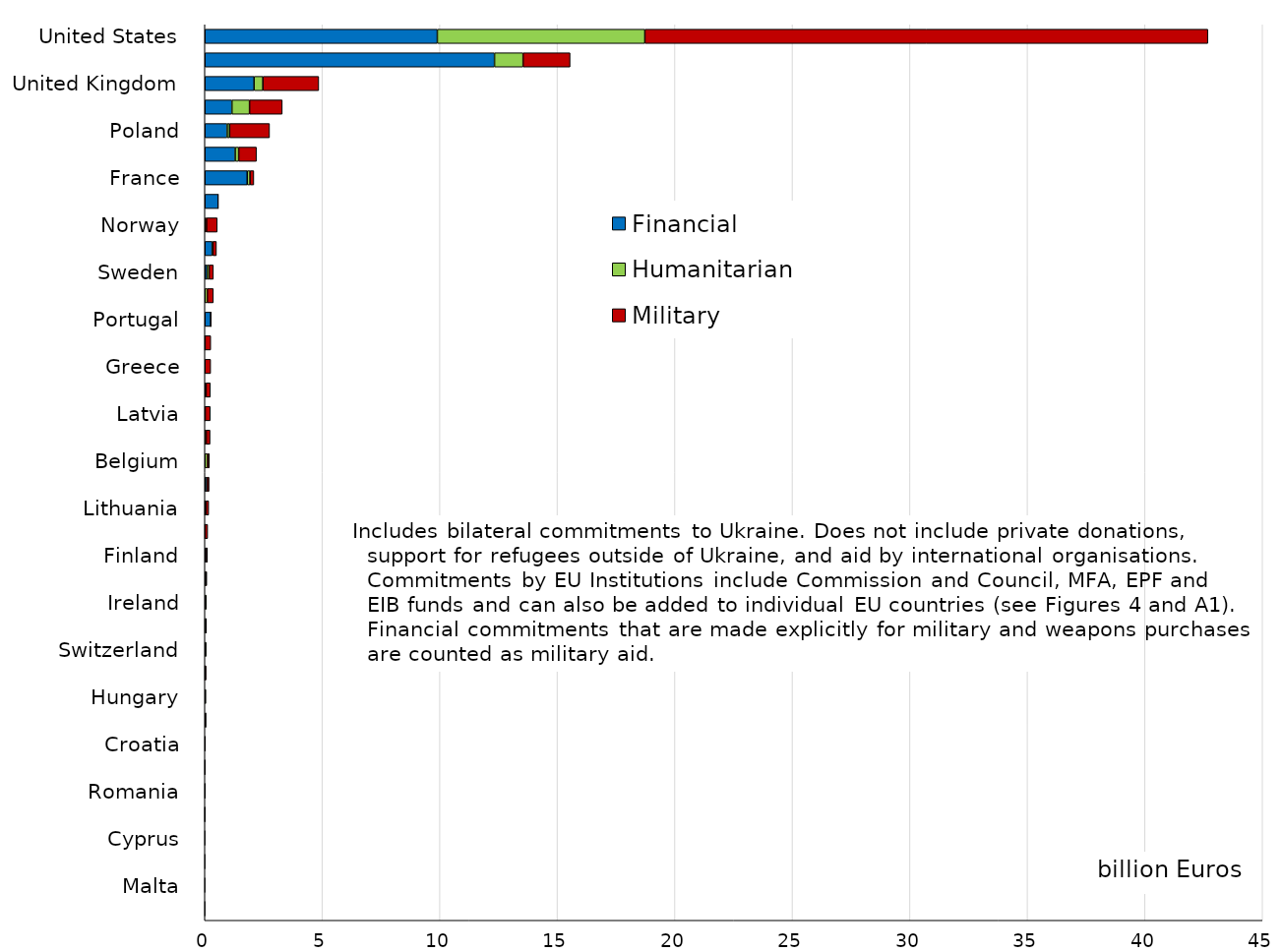
| Category | Financial | Humanitarian | Military |
|---|---|---|---|
| United States | 9.889 | 8.83 | 23.955 |
| EU Institutions | 12.322 | 1.215 | 2 |
| United Kingdom | 2.091 | 0.376 | 2.377 |
| Germany | 1.15 | 0.75 | 1.392 |
| Poland | 0.948 | 0.103 | 1.7 |
| Canada | 1.29 | 0.149 | 0.756 |
| France | 1.8 | 0.119 | 0.162 |
| Japan | 0.565 | 0.002 | 0 |
| Norway | 0.034 | 0.036 | 0.455 |
| Italy | 0.31 | 0.031 | 0.15 |
| Sweden | 0.091 | 0.086 | 0.184 |
| Czech Republic | 0 | 0.104 | 0.255 |
| Portugal | 0.25 | 0.001 | 0.009 |
| Estonia | 0 | 0.005 | 0.245 |
| Greece | 0 | 0 | 0.246 |
| Australia | 0 | 0.048 | 0.186 |
| Latvia | 0.01 | 0.001 | 0.219 |
| Denmark | 0.02 | 0.037 | 0.162 |
| Belgium | 0 | 0.116 | 0.076 |
| Netherlands | 0.08 | 0.027 | 0.071 |
| Lithuania | 0.005 | 0.042 | 0.116 |
| Slovakia | 0 | 0.005 | 0.113 |
| Finland | 0.075 | 0.002 | 0.029 |
| Spain | 0 | 0.044 | 0.037 |
| Ireland | 0 | 0.065 | 0 |
| Austria | 0.01 | 0.045 | 0.003 |
| Switzerland | 0 | 0.058 | 0 |
| Luxembourg | 0 | 0.004 | 0.05 |
| Hungary | 0 | 0.045 | 0 |
| South Korea | 0 | 0.038 | 0.003 |
| Croatia | 0 | 0.006 | 0.016 |
| New Zealand | 0 | 0.001 | 0.011 |
| Romania | 0 | 0.006 | 0.003 |
| Bulgaria | 0 | 0.001 | 0.004 |
| Cyprus | 0 | 0.002 | 0 |
| Slovenia | 0 | 0.002 | 0 |
| Malta | 0 | 0.001 | 0 |
| Turkey | 0 | 0 | 0 |